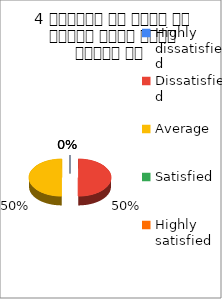
| Category | 4 शिक्षक ने विषय के प्रति रूचि रूचि जागृत की  |
|---|---|
| Highly dissatisfied | 0 |
| Dissatisfied | 1 |
| Average | 1 |
| Satisfied | 0 |
| Highly satisfied | 0 |